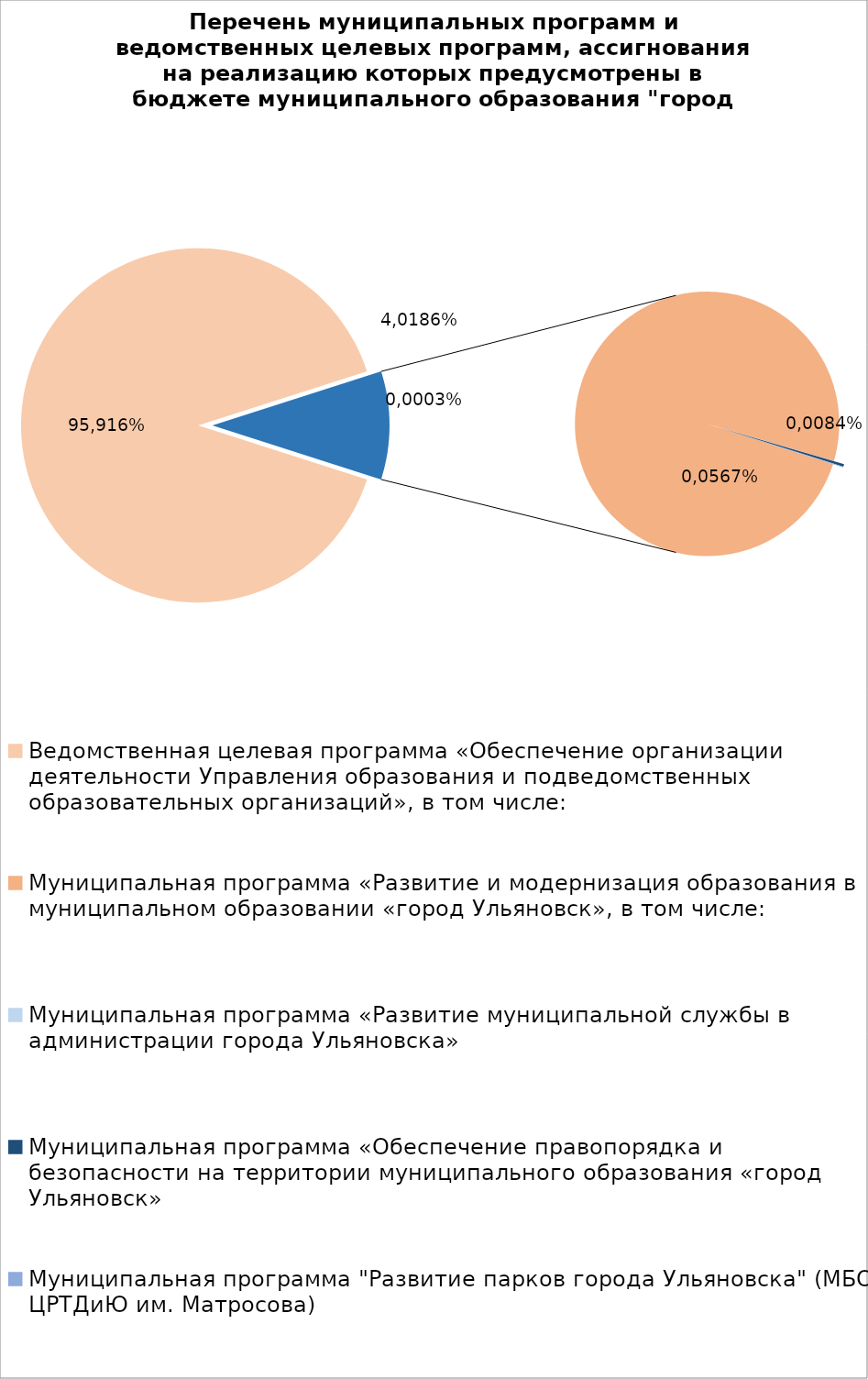
| Category | Series 0 |
|---|---|
| Ведомственная целевая программа «Обеспечение организации деятельности Управления образования и подведомственных образовательных организаций», в том числе: | 7722731.57 |
| Муниципальная программа «Развитие и модернизация образования в муниципальном образовании «город Ульяновск», в том числе: | 841349.8 |
| Муниципальная программа «Развитие муниципальной службы в администрации города Ульяновска» | 14.3 |
| Муниципальная программа «Обеспечение правопорядка и безопасности на территории муниципального образования «город Ульяновск» | 2700 |
| Муниципальная программа "Развитие парков города Ульяновска" (МБОУ ЦРТДиЮ им. Матросова) | 600 |